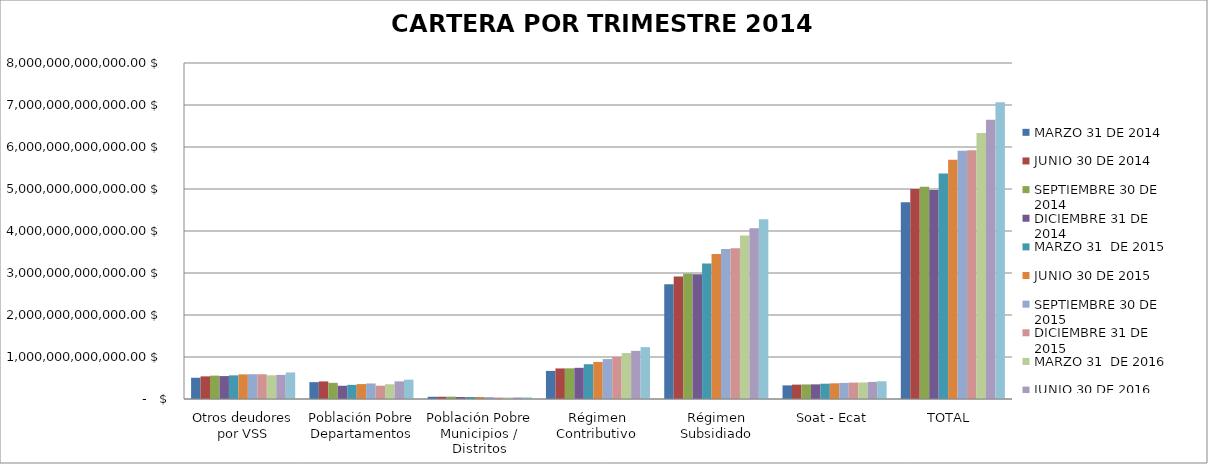
| Category | MARZO 31 DE 2014 | JUNIO 30 DE 2014  | SEPTIEMBRE 30 DE 2014 | DICIEMBRE 31 DE 2014 | MARZO 31  DE 2015 | JUNIO 30 DE 2015  | SEPTIEMBRE 30 DE 2015 | DICIEMBRE 31 DE 2015 | MARZO 31  DE 2016 | JUNIO 30 DE 2016 | SEPTIEMBRE 30 DE 2016 |
|---|---|---|---|---|---|---|---|---|---|---|---|
| Otros deudores por VSS | 505847167976 | 538861604125 | 556126990363 | 546033993278 | 562939072796 | 586326843341 | 589738642398 | 589272781992 | 564805478408 | 573766805070 | 631720940838 |
| Población Pobre Departamentos | 401604985869 | 419052315739 | 384783868070 | 315178084659 | 336887232830 | 355101294390 | 369706226009 | 317254345035 | 351030805807 | 420000245358 | 459930631914 |
| Población Pobre Municipios / Distritos | 53073697778 | 53298261099 | 55816665892 | 48038570565 | 47650192376 | 47773636631 | 45283966632 | 34334183914 | 35891235034 | 37937423732 | 38615894353 |
| Régimen Contributivo | 669024377536 | 727889573773 | 730248921832 | 742591116252 | 828135616219 | 882104091678 | 950870864868 | 1002337579590 | 1094004664516 | 1145544428697 | 1234409877308 |
| Régimen Subsidiado | 2731520823001 | 2916736642305 | 2982306479636 | 2973199221383 | 3227463096524 | 3451581898131 | 3569482038822 | 3588820050620 | 3894352877118 | 4062802152054 | 4282434713968 |
| Soat - Ecat | 324624258542 | 342073330664 | 346731005974 | 348822185969 | 364892226995 | 373685838993 | 383354012287 | 390962361871 | 393691628061 | 406957950232 | 421265979463 |
| TOTAL  | 4685695310702 | 4997911727705 | 5056013931767 | 4973863172106 | 5367967437740 | 5696573603164 | 5908435751016 | 5922981303022 | 6333776688944 | 6647009005143 | 7068378037844 |